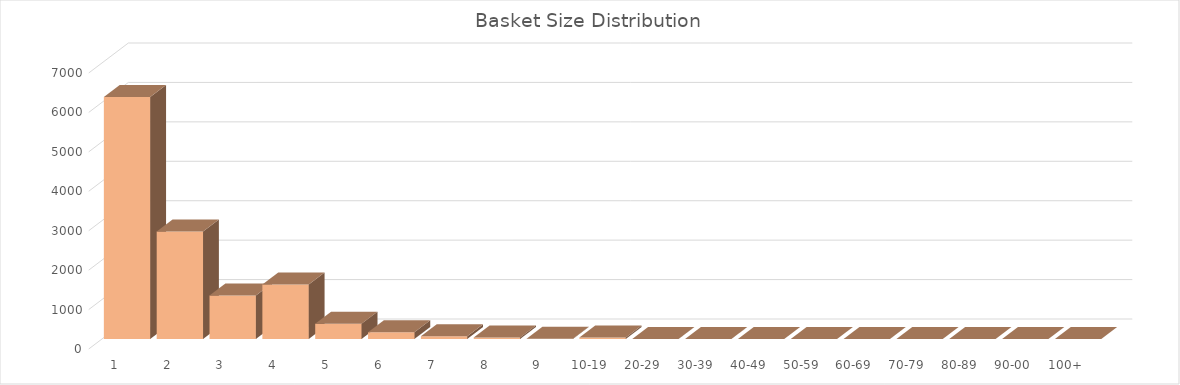
| Category | Series 0 |
|---|---|
| 1 | 6140 |
| 2 | 2729 |
| 3 | 1106 |
| 4 | 1380 |
| 5 | 389 |
| 6 | 172 |
| 7 | 69 |
| 8 | 40 |
| 9 | 9 |
| 10-19 | 38 |
| 20-29 | 1 |
| 30-39 | 1 |
| 40-49 | 0 |
| 50-59 | 0 |
| 60-69 | 1 |
| 70-79 | 0 |
| 80-89 | 0 |
| 90-00 | 0 |
| 100+ | 0 |